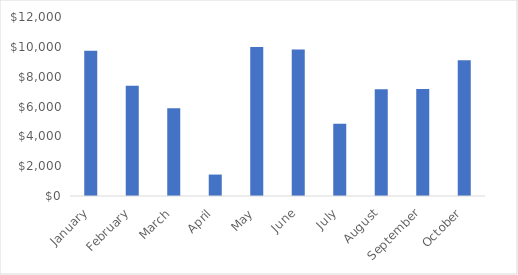
| Category | Profit |
|---|---|
| January | 9742 |
| February | 7389 |
| March | 5880 |
| April | 1437 |
| May | 9985 |
| June | 9825 |
| July | 4838 |
| August | 7161 |
| September | 7176 |
| October | 9094 |